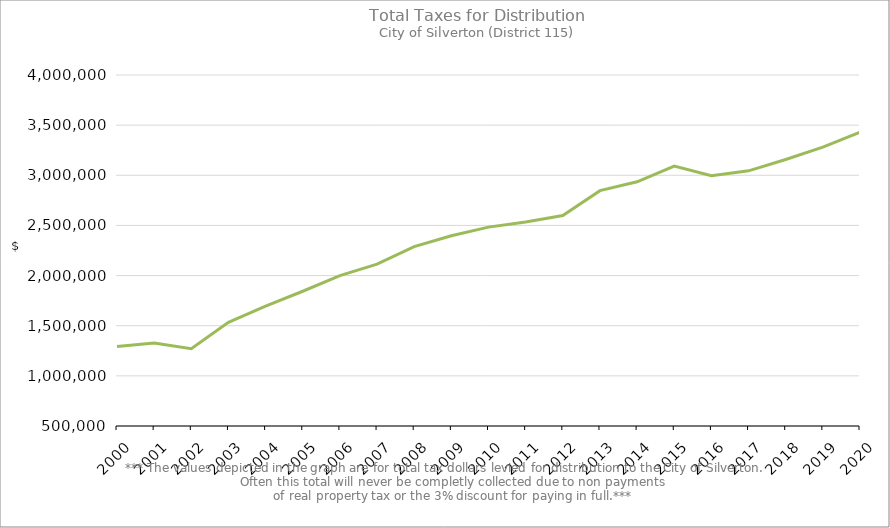
| Category | Series 0 |
|---|---|
| 2000.0 | 1293118.97 |
| 2001.0 | 1327400.84 |
| 2002.0 | 1271037.81 |
| 2003.0 | 1534167.14 |
| 2004.0 | 1695309.68 |
| 2005.0 | 1843627.61 |
| 2006.0 | 1999778.3 |
| 2007.0 | 2113208.77 |
| 2008.0 | 2288336.09 |
| 2009.0 | 2397251.4 |
| 2010.0 | 2483158.58 |
| 2011.0 | 2534815.33 |
| 2012.0 | 2598031.77 |
| 2013.0 | 2846760.55 |
| 2014.0 | 2934970.28 |
| 2015.0 | 3091539.8 |
| 2016.0 | 2996365.72 |
| 2017.0 | 3044474.21 |
| 2018.0 | 3157652.22 |
| 2019.0 | 3280436.54 |
| 2020.0 | 3428445.91 |